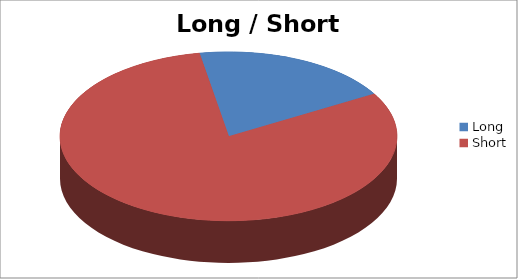
| Category | Long / Short Entries |
|---|---|
| Long | 6 |
| Short | 25 |